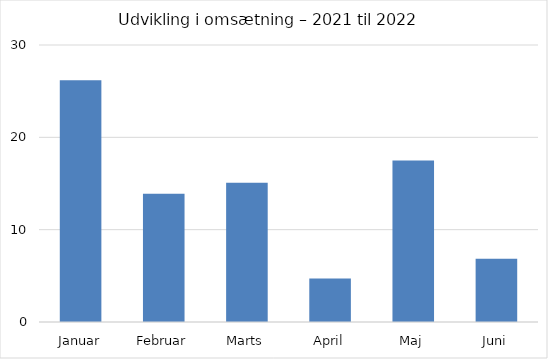
| Category | Series 0 |
|---|---|
| Januar | 26.18 |
| Februar | 13.88 |
| Marts | 15.073 |
| April | 4.713 |
| Maj | 17.494 |
| Juni | 6.852 |